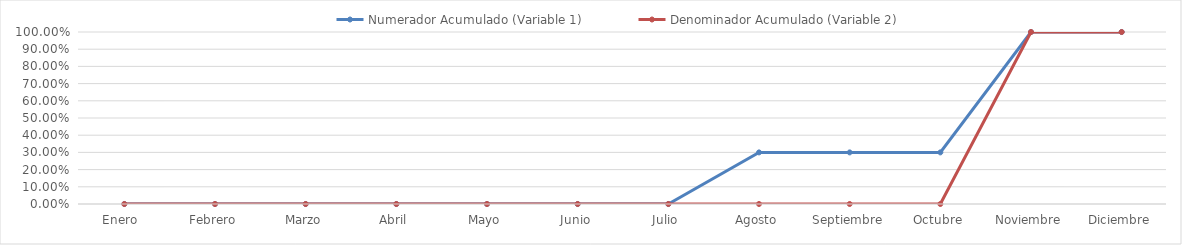
| Category | Numerador Acumulado (Variable 1) | Denominador Acumulado (Variable 2) |
|---|---|---|
| Enero  | 0 | 0 |
| Febrero | 0 | 0 |
| Marzo | 0 | 0 |
| Abril | 0 | 0 |
| Mayo | 0 | 0 |
| Junio | 0 | 0 |
| Julio | 0 | 0 |
| Agosto | 0.3 | 0 |
| Septiembre | 0.3 | 0 |
| Octubre | 0.3 | 0 |
| Noviembre | 1 | 1 |
| Diciembre | 1 | 1 |